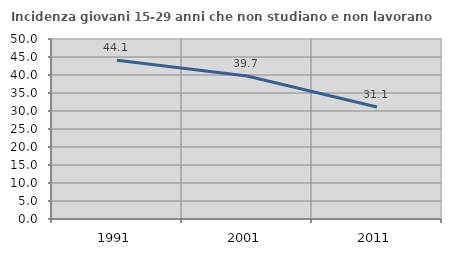
| Category | Incidenza giovani 15-29 anni che non studiano e non lavorano  |
|---|---|
| 1991.0 | 44.112 |
| 2001.0 | 39.715 |
| 2011.0 | 31.108 |